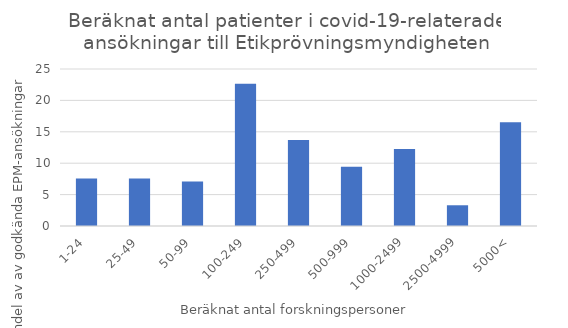
| Category | Procent |
|---|---|
| 1-24 | 7.547 |
| 25-49 | 7.547 |
| 50-99 | 7.075 |
| 100-249 | 22.642 |
| 250-499 | 13.679 |
| 500-999 | 9.434 |
| 1000-2499 | 12.264 |
| 2500-4999 | 3.302 |
| 5000< | 16.509 |